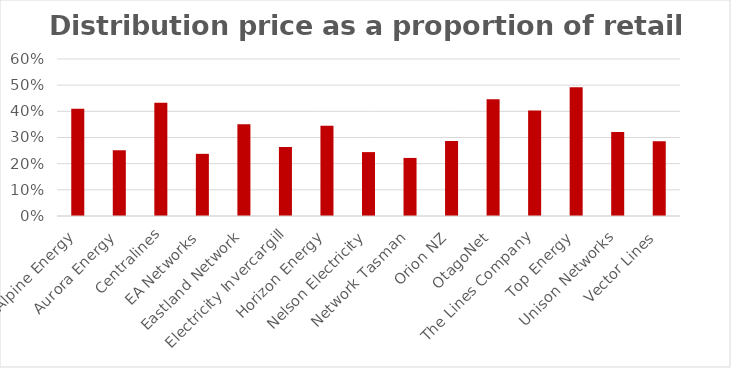
| Category | Distribution price as a proportion of retail price |
|---|---|
| Alpine Energy | 0.41 |
| Aurora Energy | 0.251 |
| Centralines | 0.433 |
| EA Networks | 0.238 |
| Eastland Network | 0.351 |
| Electricity Invercargill | 0.264 |
| Horizon Energy | 0.345 |
| Nelson Electricity | 0.244 |
| Network Tasman | 0.222 |
| Orion NZ | 0.287 |
| OtagoNet | 0.446 |
| The Lines Company | 0.403 |
| Top Energy | 0.492 |
| Unison Networks | 0.321 |
| Vector Lines | 0.286 |